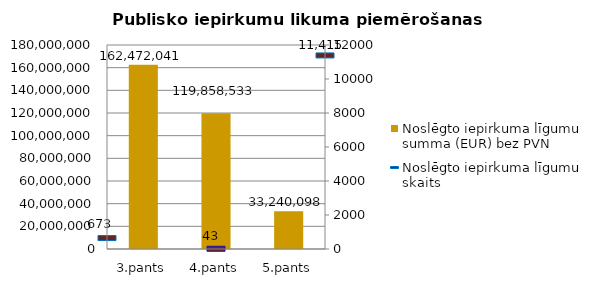
| Category | Noslēgto iepirkuma līgumu summa (EUR) bez PVN |
|---|---|
| 3.pants | 162472041 |
| 4.pants | 119858533 |
| 5.pants | 33240098 |